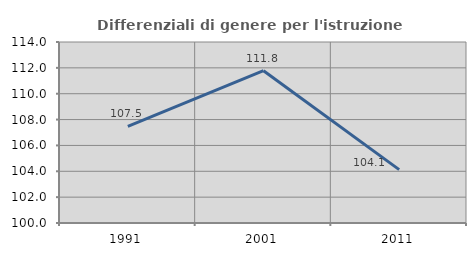
| Category | Differenziali di genere per l'istruzione superiore |
|---|---|
| 1991.0 | 107.479 |
| 2001.0 | 111.782 |
| 2011.0 | 104.128 |